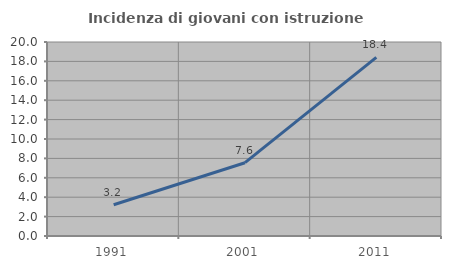
| Category | Incidenza di giovani con istruzione universitaria |
|---|---|
| 1991.0 | 3.226 |
| 2001.0 | 7.556 |
| 2011.0 | 18.421 |